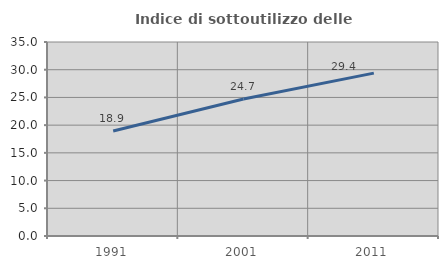
| Category | Indice di sottoutilizzo delle abitazioni  |
|---|---|
| 1991.0 | 18.935 |
| 2001.0 | 24.73 |
| 2011.0 | 29.389 |